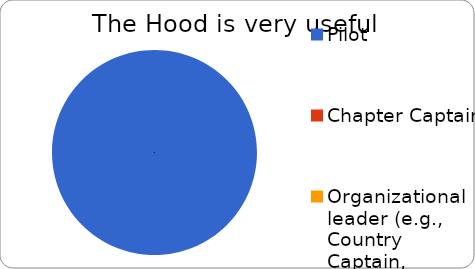
| Category | Very useful |
|---|---|
| Pilot | 1 |
| Chapter Captain | 0 |
| Organizational leader (e.g., Country Captain, member of The Hub) | 0 |